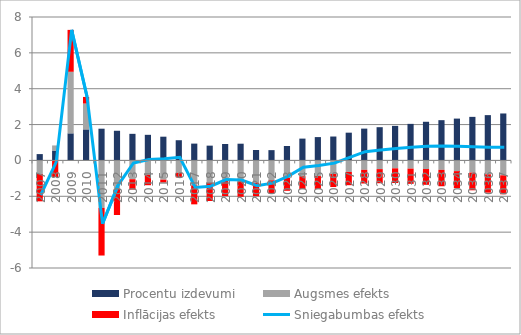
| Category | Procentu izdevumi | Augsmes efekts | Inflācijas efekts |
|---|---|---|---|
| 0 | 0.353 | -0.754 | -1.527 |
| 1 | 0.551 | 0.285 | -0.933 |
| 2 | 1.511 | 3.434 | 2.337 |
| 3 | 1.731 | 1.442 | 0.368 |
| 4 | 1.77 | -2.65 | -2.655 |
| 5 | 1.655 | -1.594 | -1.45 |
| 6 | 1.483 | -1.047 | -0.579 |
| 7 | 1.428 | -0.798 | -0.585 |
| 8 | 1.324 | -1.075 | -0.157 |
| 9 | 1.127 | -0.694 | -0.255 |
| 10 | 0.938 | -1.39 | -1.06 |
| 11 | 0.825 | -1.245 | -1.018 |
| 12 | 0.918 | -1.135 | -0.853 |
| 13 | 0.933 | -1.17 | -0.858 |
| 14 | 0.581 | -1.245 | -0.748 |
| 15 | 0.574 | -1.111 | -0.731 |
| 16 | 0.806 | -0.975 | -0.719 |
| 17 | 1.217 | -0.881 | -0.714 |
| 18 | 1.302 | -0.872 | -0.719 |
| 19 | 1.334 | -0.756 | -0.728 |
| 20 | 1.548 | -0.641 | -0.741 |
| 21 | 1.775 | -0.525 | -0.762 |
| 22 | 1.854 | -0.485 | -0.788 |
| 23 | 1.927 | -0.441 | -0.817 |
| 24 | 2.039 | -0.458 | -0.848 |
| 25 | 2.156 | -0.48 | -0.88 |
| 26 | 2.246 | -0.526 | -0.915 |
| 27 | 2.334 | -0.599 | -0.95 |
| 28 | 2.43 | -0.68 | -0.986 |
| 29 | 2.527 | -0.776 | -1.022 |
| 30 | 2.619 | -0.831 | -1.058 |